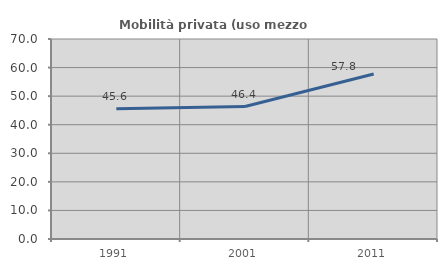
| Category | Mobilità privata (uso mezzo privato) |
|---|---|
| 1991.0 | 45.558 |
| 2001.0 | 46.362 |
| 2011.0 | 57.762 |